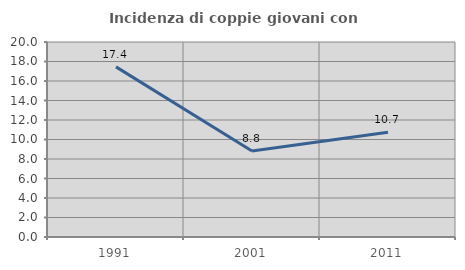
| Category | Incidenza di coppie giovani con figli |
|---|---|
| 1991.0 | 17.45 |
| 2001.0 | 8.824 |
| 2011.0 | 10.744 |